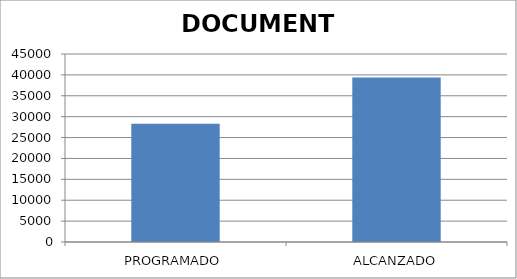
| Category | DOCUMENTO |
|---|---|
| PROGRAMADO | 28330 |
| ALCANZADO | 39383 |